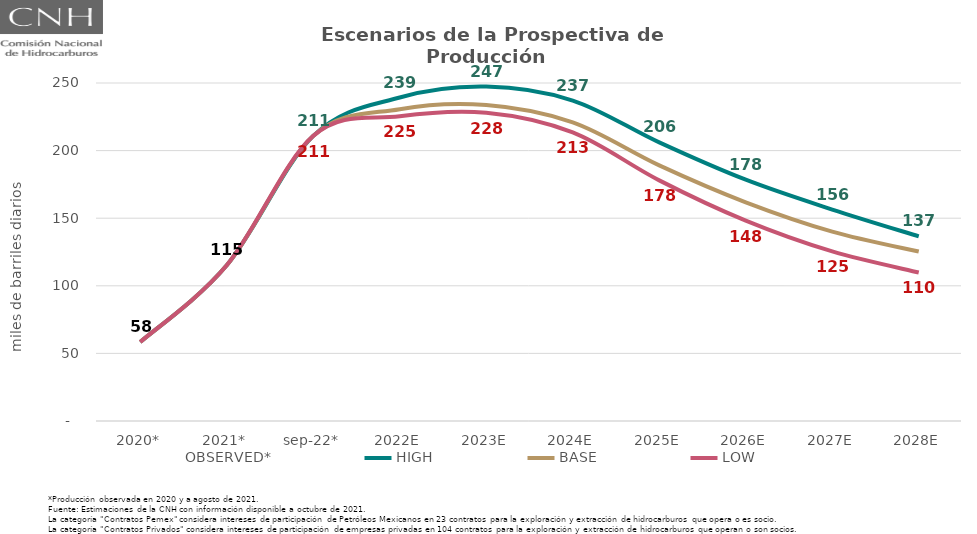
| Category | OBSERVED* | HIGH | BASE | LOW |
|---|---|---|---|---|
| 2020* | 58.421 | 58.421 | 58.421 | 58.421 |
| 2021* | 115.166 | 115.166 | 115.166 | 115.166 |
| sep-22* | 210.883 | 210.883 | 210.883 | 210.883 |
| 2022E | 230.623 | 239.262 | 230.623 | 225.356 |
| 2023E | 233.737 | 247.348 | 233.737 | 227.997 |
| 2024E | 220.901 | 237.025 | 220.901 | 213.428 |
| 2025E | 189.089 | 206.055 | 189.089 | 177.962 |
| 2026E | 161.79 | 178.45 | 161.79 | 148.19 |
| 2027E | 140.11 | 156.399 | 140.11 | 125.412 |
| 2028E | 125.321 | 136.607 | 125.321 | 109.839 |